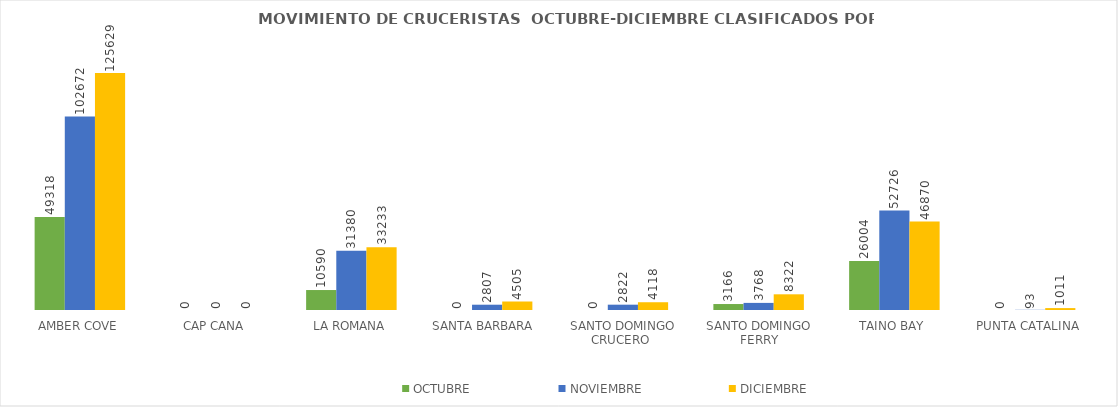
| Category | OCTUBRE | NOVIEMBRE | DICIEMBRE |
|---|---|---|---|
| AMBER COVE | 49318 | 102672 | 125629 |
| CAP CANA | 0 | 0 | 0 |
| LA ROMANA | 10590 | 31380 | 33233 |
| SANTA BARBARA  | 0 | 2807 | 4505 |
| SANTO DOMINGO CRUCERO  | 0 | 2822 | 4118 |
| SANTO DOMINGO FERRY | 3166 | 3768 | 8322 |
| TAINO BAY | 26004 | 52726 | 46870 |
| PUNTA CATALINA | 0 | 93 | 1011 |